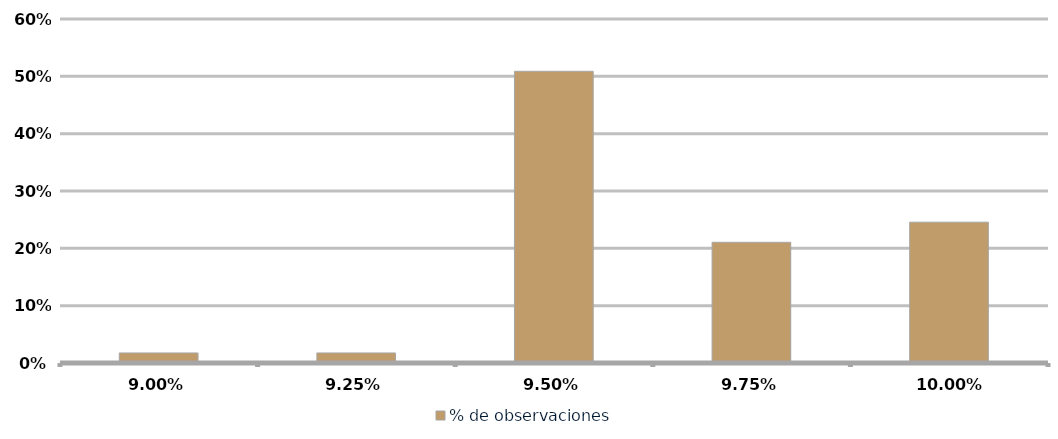
| Category | % de observaciones  |
|---|---|
| 0.09 | 0.018 |
| 0.0925 | 0.018 |
| 0.095 | 0.509 |
| 0.0975 | 0.211 |
| 0.1 | 0.246 |